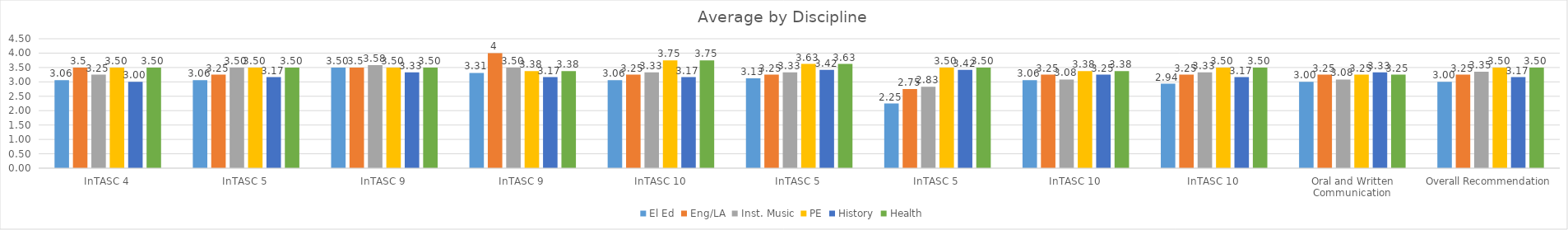
| Category | El Ed | Eng/LA | Inst. Music | PE | History | Health |
|---|---|---|---|---|---|---|
| InTASC 4 | 3.062 | 3.5 | 3.25 | 3.5 | 3 | 3.5 |
| InTASC 5 | 3.062 | 3.25 | 3.5 | 3.5 | 3.167 | 3.5 |
| InTASC 9 | 3.5 | 3.5 | 3.583 | 3.5 | 3.333 | 3.5 |
| InTASC 9 | 3.312 | 4 | 3.5 | 3.375 | 3.167 | 3.375 |
| InTASC 10 | 3.062 | 3.25 | 3.333 | 3.75 | 3.167 | 3.75 |
| InTASC 5 | 3.125 | 3.25 | 3.333 | 3.625 | 3.417 | 3.625 |
| InTASC 5 | 2.25 | 2.75 | 2.833 | 3.5 | 3.417 | 3.5 |
| InTASC 10 | 3.062 | 3.25 | 3.083 | 3.375 | 3.25 | 3.375 |
| InTASC 10 | 2.938 | 3.25 | 3.333 | 3.5 | 3.167 | 3.5 |
| Oral and Written Communication | 3 | 3.25 | 3.083 | 3.25 | 3.333 | 3.25 |
| Overall Recommendation | 3 | 3.25 | 3.35 | 3.5 | 3.167 | 3.5 |